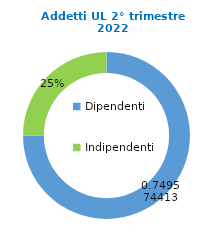
| Category | Series 0 |
|---|---|
| Dipendenti | 58122 |
| Indipendenti | 19418 |